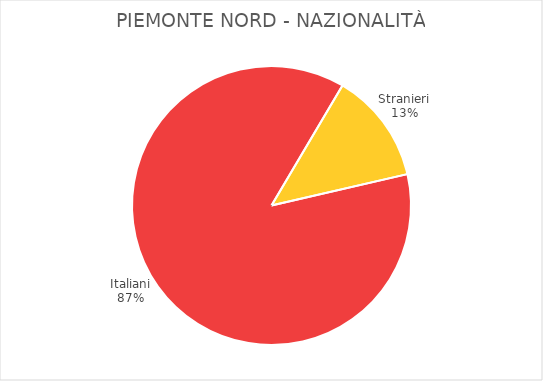
| Category | Piemonte Nord |
|---|---|
| Italiani | 5204 |
| Stranieri | 770 |